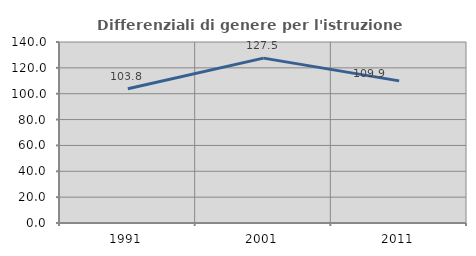
| Category | Differenziali di genere per l'istruzione superiore |
|---|---|
| 1991.0 | 103.795 |
| 2001.0 | 127.536 |
| 2011.0 | 109.944 |